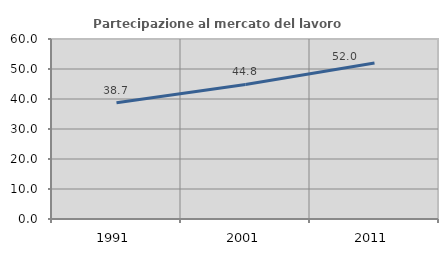
| Category | Partecipazione al mercato del lavoro  femminile |
|---|---|
| 1991.0 | 38.732 |
| 2001.0 | 44.837 |
| 2011.0 | 51.999 |